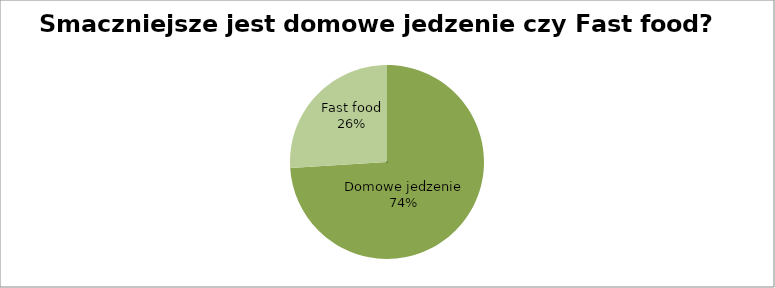
| Category | Smaczniejsze jest domowe jedzenie czy Fast food? |
|---|---|
| Domowe jedzenie | 74 |
| Fast food | 26 |